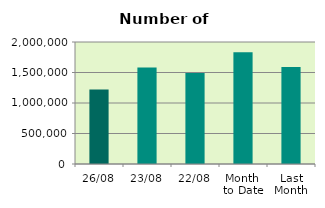
| Category | Series 0 |
|---|---|
| 26/08 | 1221386 |
| 23/08 | 1580208 |
| 22/08 | 1491500 |
| Month 
to Date | 1832714.889 |
| Last
Month | 1591495.826 |